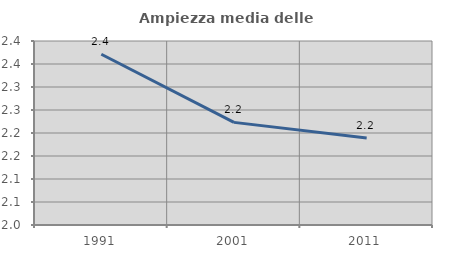
| Category | Ampiezza media delle famiglie |
|---|---|
| 1991.0 | 2.371 |
| 2001.0 | 2.223 |
| 2011.0 | 2.189 |